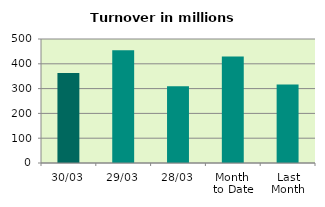
| Category | Series 0 |
|---|---|
| 30/03 | 362.555 |
| 29/03 | 454.929 |
| 28/03 | 309.958 |
| Month 
to Date | 429.929 |
| Last
Month | 316.082 |